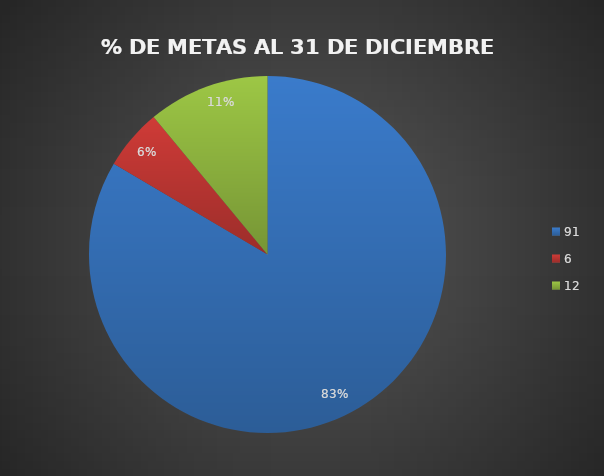
| Category | Series 0 |
|---|---|
| 91.0 | 0.835 |
| 6.0 | 0.055 |
| 12.0 | 0.11 |